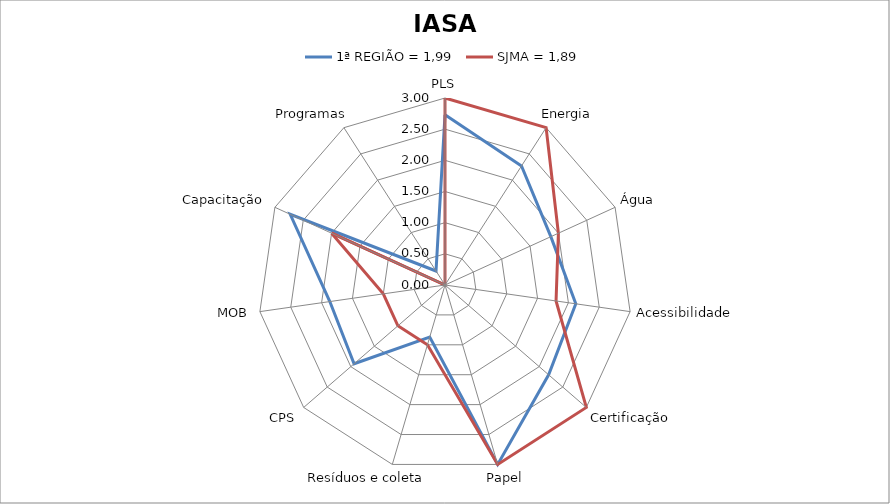
| Category | 1ª REGIÃO = 1,99 | SJMA = 1,89 |
|---|---|---|
| PLS | 2.73 | 3 |
| Energia | 2.27 | 3 |
| Água | 1.867 | 2 |
| Acessibilidade | 2.12 | 1.8 |
| Certificação | 2.2 | 3 |
| Papel | 3 | 3 |
| Resíduos e coleta | 0.87 | 1 |
| CPS | 1.93 | 1 |
| MOB | 1.867 | 1 |
| Capacitação | 2.73 | 2 |
| Programas | 0.267 | 0 |